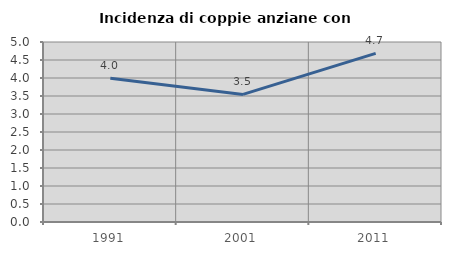
| Category | Incidenza di coppie anziane con figli |
|---|---|
| 1991.0 | 3.995 |
| 2001.0 | 3.544 |
| 2011.0 | 4.684 |